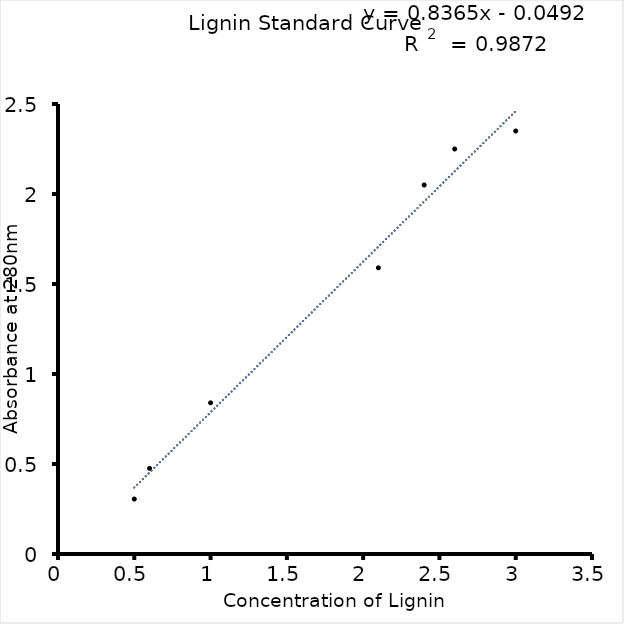
| Category | Av.Absorbance at 280nm |
|---|---|
| 0.5 | 0.305 |
| 0.6 | 0.476 |
| 1.0 | 0.84 |
| 2.1 | 1.59 |
| 2.4 | 2.05 |
| 2.6 | 2.25 |
| 3.0 | 2.35 |